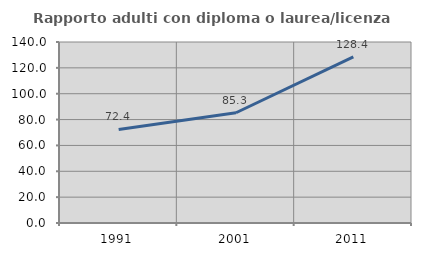
| Category | Rapporto adulti con diploma o laurea/licenza media  |
|---|---|
| 1991.0 | 72.391 |
| 2001.0 | 85.261 |
| 2011.0 | 128.44 |